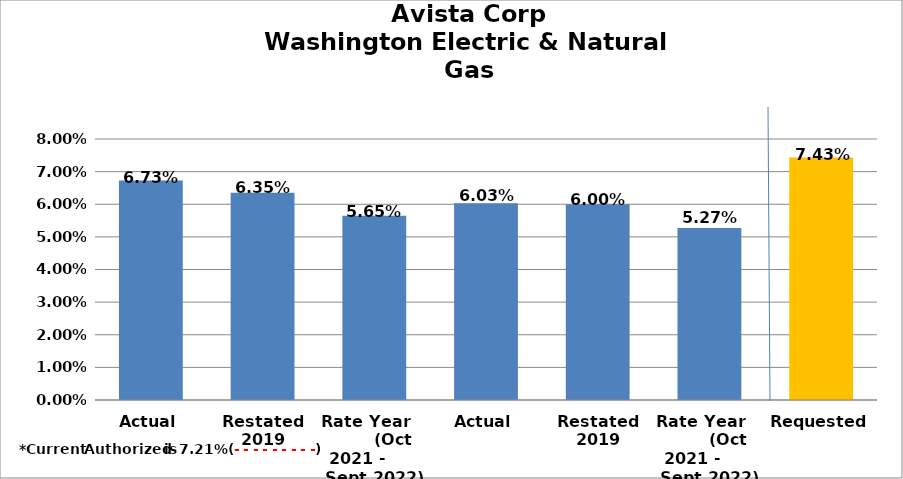
| Category | Series 0 |
|---|---|
| Actual | 0.067 |
| Restated 2019 | 0.064 |
| Rate Year          (Oct 2021 -       Sept 2022) | 0.056 |
| Actual | 0.06 |
| Restated 2019 | 0.06 |
| Rate Year          (Oct 2021 -       Sept 2022) | 0.053 |
| Requested | 0.074 |